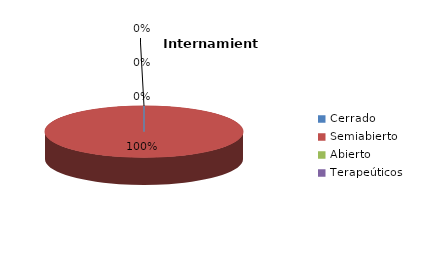
| Category | Series 0 |
|---|---|
| Cerrado | 0 |
| Semiabierto | 11 |
| Abierto | 0 |
| Terapeúticos | 0 |